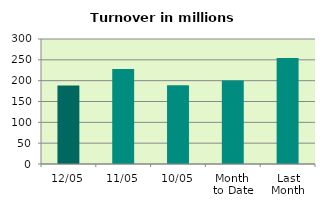
| Category | Series 0 |
|---|---|
| 12/05 | 188.655 |
| 11/05 | 227.902 |
| 10/05 | 189.187 |
| Month 
to Date | 200.292 |
| Last
Month | 254.458 |